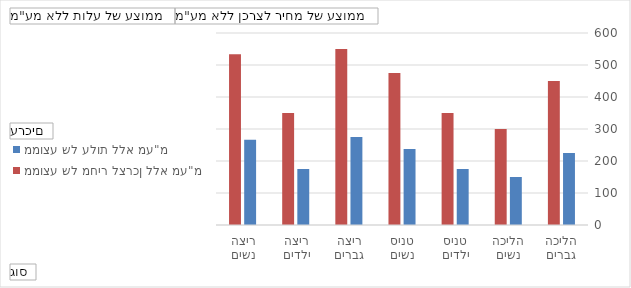
| Category | ממוצע של עלות ללא מע"מ | ממוצע של מחיר לצרכן ללא מע"מ |
|---|---|---|
| הליכה גברים | 225 | 450 |
| הליכה נשים | 150 | 300 |
| טניס ילדים | 175 | 350 |
| טניס נשים | 237.5 | 475 |
| ריצה גברים | 275 | 550 |
| ריצה ילדים | 175 | 350 |
| ריצה נשים | 266.667 | 533.333 |